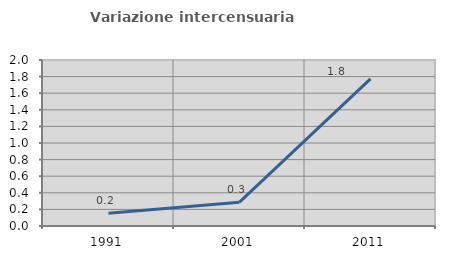
| Category | Variazione intercensuaria annua |
|---|---|
| 1991.0 | 0.155 |
| 2001.0 | 0.287 |
| 2011.0 | 1.773 |